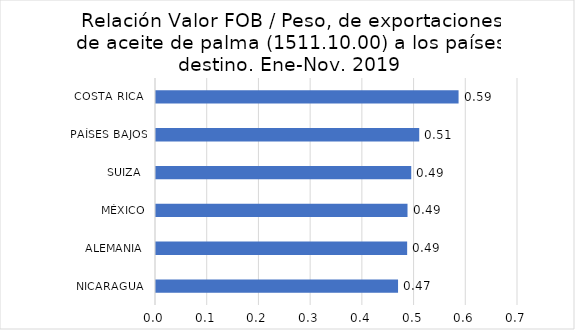
| Category | Series 0 |
|---|---|
| NICARAGUA  | 0.468 |
| ALEMANIA  | 0.486 |
| MÉXICO | 0.486 |
| SUIZA  | 0.494 |
| PAÍSES BAJOS | 0.509 |
| COSTA RICA  | 0.585 |